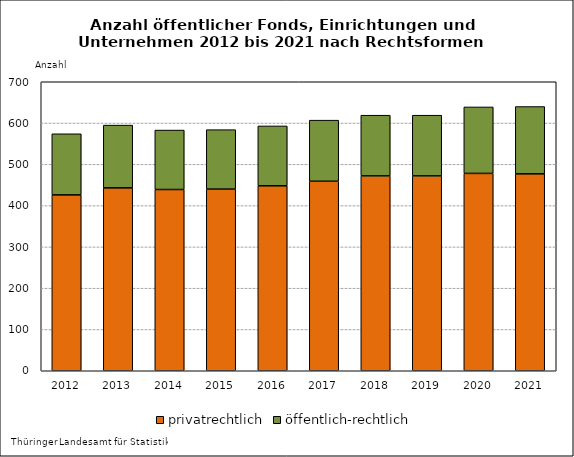
| Category | privatrechtlich | öffentlich-rechtlich |
|---|---|---|
| 2012.0 | 426 | 148 |
| 2013.0 | 443 | 152 |
| 2014.0 | 439 | 144 |
| 2015.0 | 440 | 144 |
| 2016.0 | 448 | 145 |
| 2017.0 | 459 | 148 |
| 2018.0 | 472 | 147 |
| 2019.0 | 472 | 147 |
| 2020.0 | 478 | 161 |
| 2021.0 | 477 | 163 |